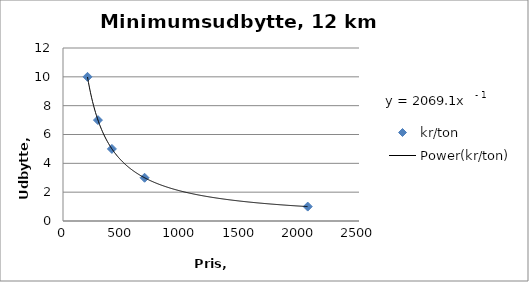
| Category | kr/ton |
|---|---|
| 2067.0 | 1 |
| 689.0 | 3 |
| 413.0 | 5 |
| 295.0 | 7 |
| 207.0 | 10 |